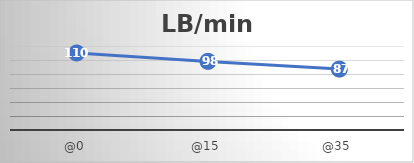
| Category | LB/min |
|---|---|
| @0 | 110 |
| @15 | 98 |
| @35 | 87 |